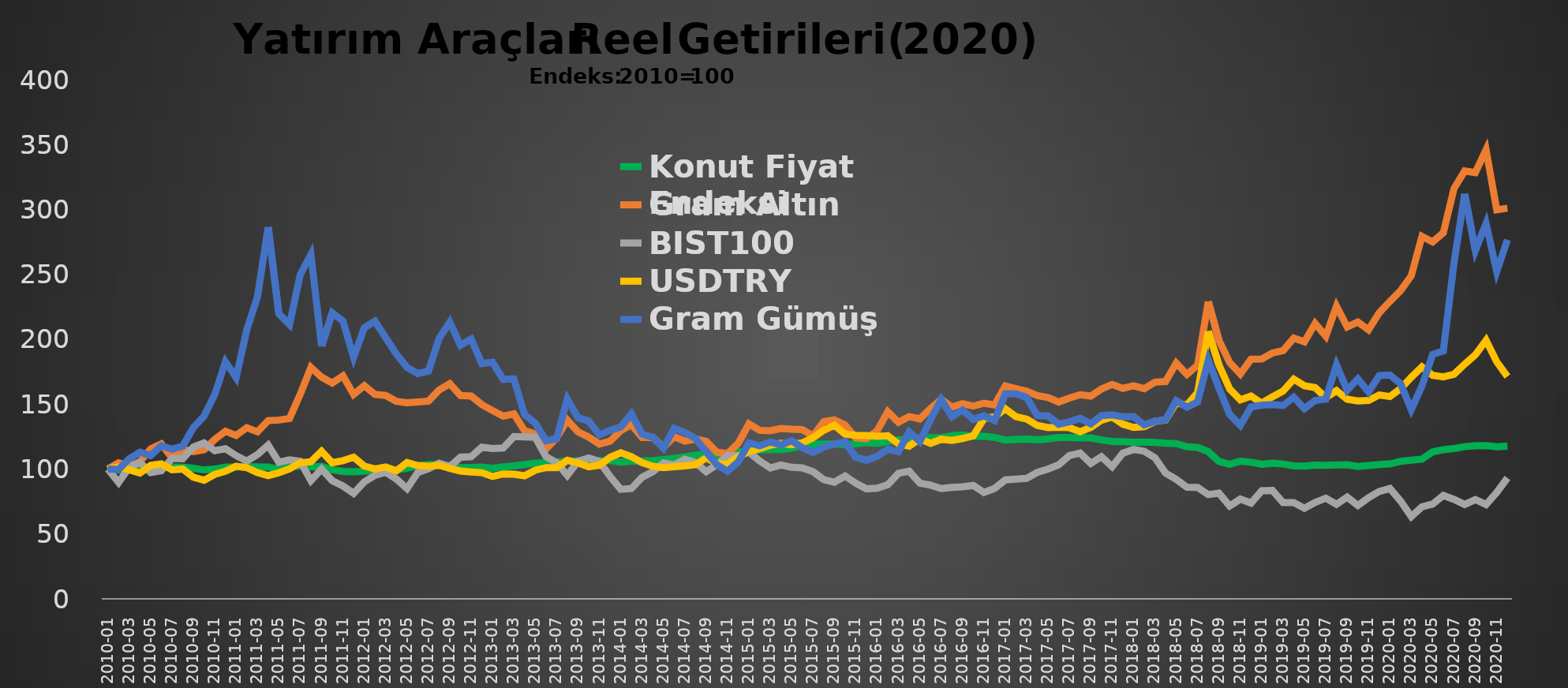
| Category |  Konut Fiyat Endeksi  |  Gram Altın  |  BIST100  |  USDTRY  |  Gram Gümüş  |
|---|---|---|---|---|---|
| 2010-01 | 100 | 100 | 100 | 100 | 100 |
| 2010-02 | 99.073 | 104.843 | 89.654 | 101.551 | 99.707 |
| 2010-03 | 99.341 | 102.383 | 101.387 | 99.462 | 107.999 |
| 2010-04 | 99.31 | 105.612 | 105.1 | 96.899 | 113.038 |
| 2010-05 | 100.292 | 115.585 | 97.295 | 102.782 | 110.445 |
| 2010-06 | 100.902 | 119.346 | 98.662 | 103.934 | 117.919 |
| 2010-07 | 101.606 | 108.576 | 108.226 | 99.437 | 115.356 |
| 2010-08 | 101.567 | 115.292 | 107.983 | 100.057 | 117.736 |
| 2010-09 | 100.572 | 113.469 | 116.994 | 93.745 | 131.918 |
| 2010-10 | 99.332 | 114.89 | 120.105 | 91.389 | 140.712 |
| 2010-11 | 99.935 | 122.854 | 114.118 | 95.931 | 157.4 |
| 2010-12 | 101.567 | 129.079 | 115.608 | 98.306 | 182.62 |
| 2011-01 | 101.549 | 125.894 | 110.378 | 102.19 | 170.451 |
| 2011-02 | 101.754 | 131.923 | 106.126 | 101.053 | 207.33 |
| 2011-03 | 101.724 | 128.682 | 111.117 | 97.281 | 232.708 |
| 2011-04 | 101.531 | 137.337 | 118.396 | 94.953 | 286.374 |
| 2011-05 | 99.835 | 137.766 | 105.241 | 97.129 | 219.612 |
| 2011-06 | 101.59 | 139.006 | 107.147 | 100.208 | 211.275 |
| 2011-07 | 102.356 | 157.652 | 105.932 | 104.806 | 249.71 |
| 2011-08 | 101.659 | 178.28 | 91.072 | 105.703 | 265.379 |
| 2011-09 | 102.171 | 170.84 | 100.022 | 113.775 | 194.758 |
| 2011-10 | 99.423 | 166.231 | 90.96 | 104.873 | 220.362 |
| 2011-11 | 98.138 | 171.832 | 86.954 | 106.454 | 214.014 |
| 2011-12 | 97.901 | 157.478 | 81.3 | 109.123 | 185.975 |
| 2012-01 | 98.265 | 164.286 | 90.157 | 102.297 | 208.888 |
| 2012-02 | 99.112 | 157.435 | 95.218 | 100.062 | 213.851 |
| 2012-03 | 99.663 | 156.685 | 97.483 | 101.555 | 201.175 |
| 2012-04 | 99.418 | 152.129 | 92.317 | 98.629 | 188.629 |
| 2012-05 | 100.763 | 151.092 | 84.942 | 105.016 | 178.356 |
| 2012-06 | 102.573 | 151.723 | 97.29 | 102.698 | 173.567 |
| 2012-07 | 103.466 | 152.362 | 100.189 | 102.109 | 175.458 |
| 2012-08 | 103.434 | 160.892 | 104.452 | 102.873 | 200.559 |
| 2012-09 | 102.617 | 165.744 | 101.895 | 100.578 | 213.157 |
| 2012-10 | 101.061 | 156.655 | 109.165 | 98.489 | 195.408 |
| 2012-11 | 101.222 | 156.298 | 109.548 | 97.773 | 200.245 |
| 2012-12 | 101.522 | 149.627 | 116.825 | 97.206 | 181.273 |
| 2013-01 | 100.674 | 145.086 | 115.778 | 94.3 | 182.362 |
| 2013-02 | 101.68 | 140.753 | 116.238 | 96.212 | 169.021 |
| 2013-03 | 102.448 | 142.558 | 125.029 | 96.09 | 169.495 |
| 2013-04 | 103.452 | 129.583 | 124.719 | 94.814 | 141.888 |
| 2013-05 | 104.557 | 127.099 | 124.456 | 99.106 | 135.372 |
| 2013-06 | 104.872 | 115.305 | 109.587 | 101.083 | 121.912 |
| 2013-07 | 105.513 | 124.185 | 105.07 | 101.109 | 123.335 |
| 2013-08 | 106.296 | 137.77 | 95.169 | 106.711 | 153.968 |
| 2013-09 | 106.328 | 128.7 | 105.958 | 104.737 | 139.57 |
| 2013-10 | 105.172 | 124.659 | 108.464 | 101.809 | 136.976 |
| 2013-11 | 106.493 | 119.244 | 105.838 | 102.963 | 126.333 |
| 2013-12 | 106.575 | 121.486 | 94.301 | 108.963 | 129.806 |
| 2014-01 | 105.378 | 129.592 | 84.366 | 112.553 | 132.424 |
| 2014-02 | 106.058 | 134.325 | 84.95 | 109.548 | 142.496 |
| 2014-03 | 106.269 | 124.302 | 93.651 | 104.91 | 126.929 |
| 2014-04 | 106.583 | 124.4 | 97.887 | 102.182 | 124.495 |
| 2014-05 | 107.308 | 116.892 | 104.653 | 101.037 | 116.074 |
| 2014-06 | 108.165 | 124.833 | 103.275 | 101.782 | 131.37 |
| 2014-07 | 109.317 | 121.55 | 107.613 | 102.431 | 128.241 |
| 2014-08 | 110.727 | 123.095 | 105.098 | 103.391 | 123.612 |
| 2014-09 | 111.659 | 121.403 | 97.927 | 108.702 | 113.068 |
| 2014-10 | 110.52 | 112.992 | 103.337 | 104.052 | 103.291 |
| 2014-11 | 111.739 | 111.97 | 110.304 | 103.719 | 98.301 |
| 2014-12 | 113.304 | 119.805 | 110.219 | 109.585 | 105.565 |
| 2015-01 | 113.616 | 134.824 | 113.119 | 113.579 | 120.222 |
| 2015-02 | 114.773 | 129.858 | 106.257 | 115.669 | 117.922 |
| 2015-03 | 115.202 | 129.475 | 100.892 | 118.362 | 120.891 |
| 2015-04 | 114.997 | 131.263 | 103.082 | 119.805 | 118.712 |
| 2015-05 | 116.045 | 130.657 | 101.325 | 118.72 | 121.895 |
| 2015-06 | 118.212 | 130.4 | 100.951 | 120.18 | 116.419 |
| 2015-07 | 119.112 | 125.62 | 97.992 | 124.064 | 112.923 |
| 2015-08 | 119.358 | 136.537 | 91.861 | 129.908 | 116.876 |
| 2015-09 | 119.234 | 137.877 | 89.831 | 133.737 | 119.216 |
| 2015-10 | 118.716 | 133.954 | 94.659 | 126.874 | 121.039 |
| 2015-11 | 119.457 | 124.04 | 89.087 | 125.948 | 109.094 |
| 2015-12 | 120.305 | 123.42 | 84.76 | 125.885 | 106.885 |
| 2016-01 | 119.821 | 129.47 | 85.282 | 125.231 | 109.834 |
| 2016-02 | 121.134 | 144.124 | 88.009 | 125.687 | 115.179 |
| 2016-03 | 122.47 | 136.045 | 96.701 | 119.443 | 113.416 |
| 2016-04 | 123.017 | 140.48 | 98.322 | 117.609 | 128.691 |
| 2016-05 | 123.786 | 138.608 | 89.136 | 123.355 | 121.323 |
| 2016-06 | 124.277 | 146.6 | 87.593 | 119.79 | 138.154 |
| 2016-07 | 124.002 | 153.646 | 84.995 | 122.982 | 153.623 |
| 2016-08 | 125.697 | 147.809 | 85.877 | 122.089 | 140.374 |
| 2016-09 | 126.232 | 150.364 | 86.31 | 123.538 | 145.458 |
| 2016-10 | 125.259 | 148.496 | 87.364 | 125.662 | 138.235 |
| 2016-11 | 125.295 | 150.762 | 81.889 | 138.884 | 141.027 |
| 2016-12 | 124.358 | 149.379 | 85.077 | 140.245 | 137.438 |
| 2017-01 | 122.305 | 164.066 | 91.701 | 146.413 | 157.902 |
| 2017-02 | 122.821 | 161.976 | 92.21 | 140.376 | 157.958 |
| 2017-03 | 123.031 | 159.979 | 92.816 | 138.507 | 155.21 |
| 2017-04 | 122.536 | 156.632 | 97.497 | 133.575 | 141.218 |
| 2017-05 | 123.251 | 155.135 | 100.024 | 131.985 | 140.856 |
| 2017-06 | 124.263 | 151.651 | 103.272 | 132.196 | 134.602 |
| 2017-07 | 124.314 | 154.744 | 110.399 | 131.929 | 136.383 |
| 2017-08 | 124.029 | 157.297 | 112.361 | 128.763 | 139.068 |
| 2017-09 | 123.972 | 156.205 | 104.427 | 132.045 | 134.822 |
| 2017-10 | 122.42 | 161.69 | 109.494 | 137.647 | 141.226 |
| 2017-11 | 121.305 | 165.212 | 101.853 | 140.131 | 141.723 |
| 2017-12 | 121.194 | 162.201 | 112.199 | 134.629 | 140.309 |
| 2018-01 | 120.724 | 164.209 | 115.107 | 132.049 | 140.353 |
| 2018-02 | 120.757 | 161.941 | 113.718 | 132.609 | 134.003 |
| 2018-03 | 120.504 | 166.978 | 108.794 | 136.711 | 136.838 |
| 2018-04 | 119.879 | 167.461 | 96.901 | 137.813 | 137.926 |
| 2018-05 | 119.607 | 181.64 | 92.034 | 151.069 | 152.706 |
| 2018-06 | 117.153 | 172.902 | 86.009 | 149.264 | 147.616 |
| 2018-07 | 116.681 | 180.05 | 85.921 | 158.92 | 151.724 |
| 2018-08 | 113.479 | 229.069 | 80.329 | 206.24 | 183.922 |
| 2018-09 | 105.845 | 199.116 | 81.46 | 180.227 | 162.195 |
| 2018-10 | 103.782 | 182.04 | 71.598 | 161.751 | 142.146 |
| 2018-11 | 106.01 | 173.281 | 76.847 | 153.309 | 133.615 |
| 2018-12 | 105.252 | 184.609 | 73.807 | 156.174 | 147.836 |
| 2019-01 | 103.691 | 184.811 | 83.275 | 150.816 | 149.209 |
| 2019-02 | 104.497 | 189.42 | 83.505 | 155.636 | 149.645 |
| 2019-03 | 103.881 | 191.222 | 74.158 | 160.013 | 148.945 |
| 2019-04 | 102.404 | 200.918 | 74.192 | 169.31 | 155.342 |
| 2019-05 | 102.249 | 198.068 | 69.777 | 164.215 | 146.556 |
| 2019-06 | 103.001 | 212.161 | 74.298 | 162.768 | 152.861 |
| 2019-07 | 102.895 | 202.345 | 77.556 | 154.988 | 153.851 |
| 2019-08 | 103.144 | 225.484 | 72.856 | 160.387 | 180.23 |
| 2019-09 | 103.289 | 209.509 | 78.341 | 153.859 | 160.755 |
| 2019-10 | 102.054 | 213.328 | 72.003 | 152.404 | 169.457 |
| 2019-11 | 102.773 | 207.34 | 77.874 | 152.877 | 159.373 |
| 2019-12 | 103.452 | 220.406 | 82.738 | 157.081 | 172.04 |
| 2020-01 | 103.921 | 229.158 | 84.999 | 155.855 | 172.498 |
| 2020-02 | 105.955 | 237.473 | 75.355 | 161.995 | 165.794 |
| 2020-03 | 106.801 | 248.875 | 63.369 | 170.687 | 145.812 |
| 2020-04 | 107.67 | 279.311 | 70.869 | 178.762 | 164.068 |
| 2020-05 | 113.221 | 274.973 | 72.966 | 172.2 | 188.309 |
| 2020-06 | 114.918 | 282.086 | 79.673 | 171.064 | 191.01 |
| 2020-07 | 115.807 | 316.102 | 76.604 | 173.055 | 258.924 |
| 2020-08 | 117.251 | 329.647 | 72.693 | 180.838 | 312 |
| 2020-09 | 117.97 | 328.428 | 76.439 | 188.092 | 268.384 |
| 2020-10 | 118.028 | 346.013 | 72.696 | 199.184 | 289.24 |
| 2020-11 | 117.147 | 299.788 | 82.001 | 182.66 | 252.141 |
| 2020-12 | 117.678 | 300.977 | 93.175 | 171.271 | 276.713 |